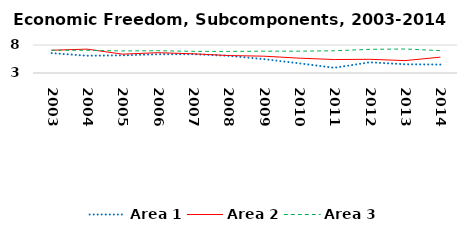
| Category | Area 1 | Area 2 | Area 3 |
|---|---|---|---|
| 2003.0 | 6.553 | 7.068 | 7.062 |
| 2004.0 | 6.088 | 7.263 | 7.056 |
| 2005.0 | 6.154 | 6.366 | 6.941 |
| 2006.0 | 6.343 | 6.627 | 6.98 |
| 2007.0 | 6.363 | 6.431 | 6.868 |
| 2008.0 | 6.079 | 6.117 | 6.853 |
| 2009.0 | 5.484 | 6.004 | 6.893 |
| 2010.0 | 4.73 | 5.655 | 6.902 |
| 2011.0 | 3.931 | 5.402 | 6.969 |
| 2012.0 | 4.913 | 5.449 | 7.227 |
| 2013.0 | 4.554 | 5.214 | 7.286 |
| 2014.0 | 4.51 | 5.831 | 6.996 |